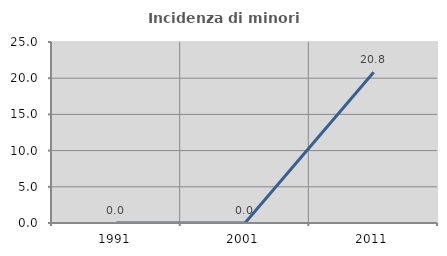
| Category | Incidenza di minori stranieri |
|---|---|
| 1991.0 | 0 |
| 2001.0 | 0 |
| 2011.0 | 20.833 |